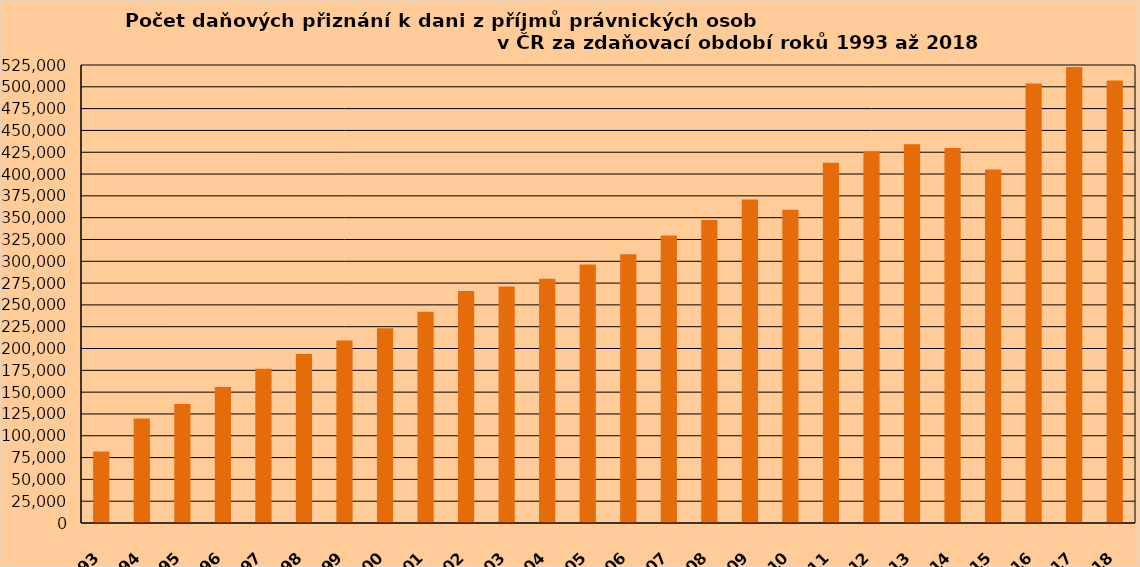
| Category | Series 1 |
|---|---|
| 1993 | 81950 |
| 1994 | 119831 |
| 1995 | 136334 |
| 1996 | 156029 |
| 1997 | 176934 |
| 1998 | 193797 |
| 1999 | 209106 |
| 2000 | 223307 |
| 2001 | 242164 |
| 2002 | 265813 |
| 2003 | 270968 |
| 2004 | 279964 |
| 2005 | 296271 |
| 2006 | 307986 |
| 2007 | 329481 |
| 2008 | 347457 |
| 2009 | 370709 |
| 2010 | 359084 |
| *2011 | 413082 |
| 2012 | 425837 |
| 2013 | 434095 |
| 2014 | 429981 |
| 2015 | 405197 |
| 2016 | 503920 |
| 2017 | 522772 |
| 2018 | 507195 |